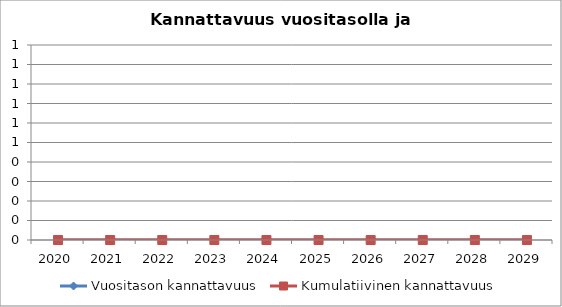
| Category | Vuositason kannattavuus | Kumulatiivinen kannattavuus |
|---|---|---|
| 2020 | 0 | 0 |
| 2021 | 0 | 0 |
| 2022 | 0 | 0 |
| 2023 | 0 | 0 |
| 2024 | 0 | 0 |
| 2025 | 0 | 0 |
| 2026 | 0 | 0 |
| 2027 | 0 | 0 |
| 2028 | 0 | 0 |
| 2029 | 0 | 0 |